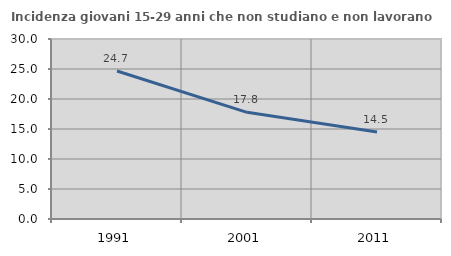
| Category | Incidenza giovani 15-29 anni che non studiano e non lavorano  |
|---|---|
| 1991.0 | 24.662 |
| 2001.0 | 17.777 |
| 2011.0 | 14.483 |